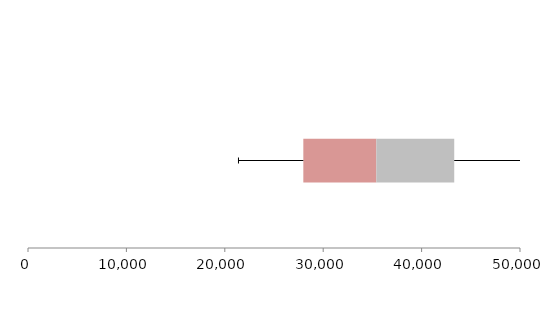
| Category | Series 1 | Series 2 | Series 3 |
|---|---|---|---|
| 0 | 27980.16 | 7419.79 | 7915.863 |